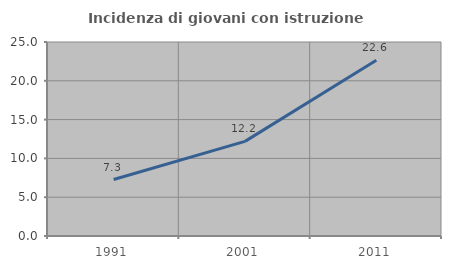
| Category | Incidenza di giovani con istruzione universitaria |
|---|---|
| 1991.0 | 7.273 |
| 2001.0 | 12.195 |
| 2011.0 | 22.642 |